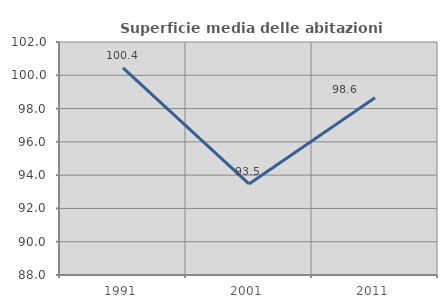
| Category | Superficie media delle abitazioni occupate |
|---|---|
| 1991.0 | 100.45 |
| 2001.0 | 93.471 |
| 2011.0 | 98.646 |